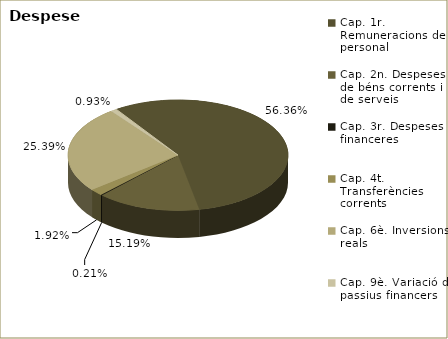
| Category | Series 0 |
|---|---|
| Cap. 1r. Remuneracions de personal | 194505335 |
| Cap. 2n. Despeses de béns corrents i de serveis | 52427389 |
| Cap. 3r. Despeses financeres | 736584 |
| Cap. 4t. Transferències corrents | 6617738 |
| Cap. 6è. Inversions reals | 87633363 |
| Cap. 9è. Variació de passius financers | 3205783 |